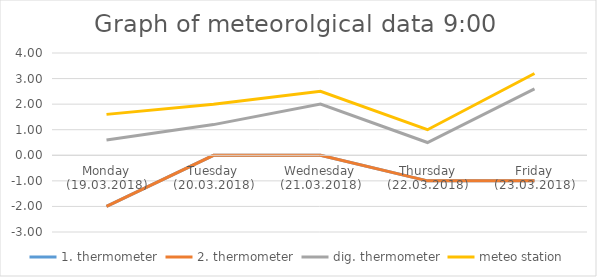
| Category | 1. thermometer | 2. thermometer | dig. thermometer | meteo station |
|---|---|---|---|---|
| Monday (19.03.2018) | -2 | -2 | 0.6 | 1.6 |
| Tuesday (20.03.2018) | 0 | 0 | 1.2 | 2 |
| Wednesday (21.03.2018) | 0 | 0 | 2 | 2.5 |
| Thursday (22.03.2018) | -1 | -1 | 0.5 | 1 |
| Friday (23.03.2018) | -1 | -1 | 2.6 | 3.2 |